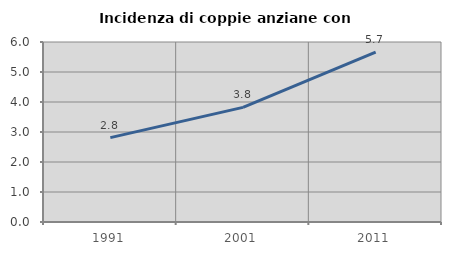
| Category | Incidenza di coppie anziane con figli |
|---|---|
| 1991.0 | 2.812 |
| 2001.0 | 3.821 |
| 2011.0 | 5.66 |